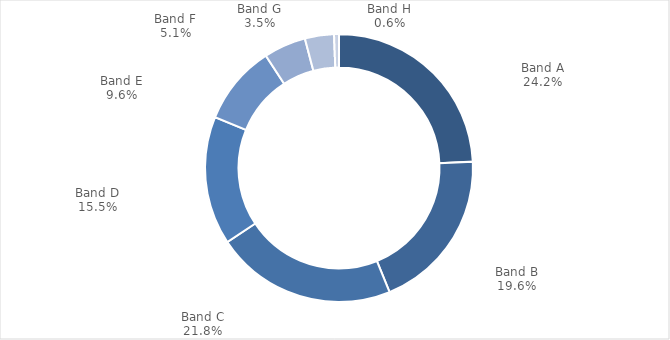
| Category | Series 0 |
|---|---|
|  Band A  | 0.242 |
|  Band B  | 0.196 |
|  Band C  | 0.218 |
|  Band D  | 0.155 |
|  Band E  | 0.096 |
|  Band F  | 0.051 |
|  Band G  | 0.035 |
|  Band H  | 0.006 |